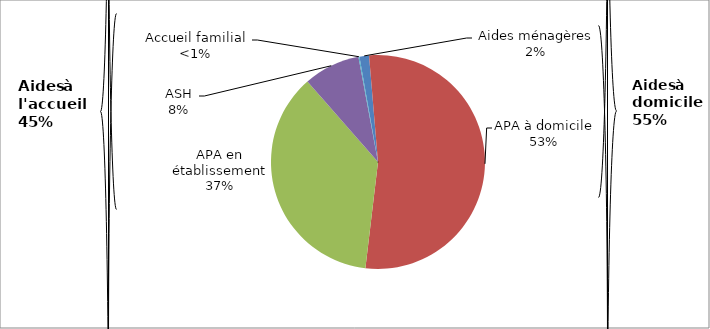
| Category | Series 0 |
|---|---|
| Aides ménagères | 20110 |
| APA à domicile | 741210 |
| APA en établissement | 510630 |
| ASH | 118780 |
| Accueil familial | 2130 |